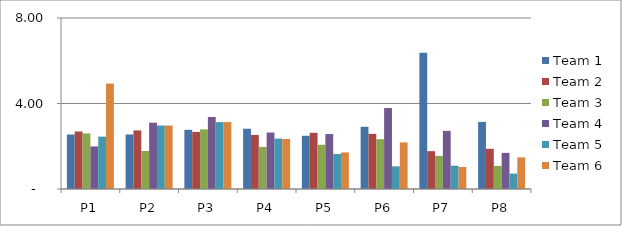
| Category | Team 1 | Team 2 | Team 3 | Team 4 | Team 5 | Team 6 |
|---|---|---|---|---|---|---|
| P1 | 2.55 | 2.69 | 2.6 | 1.99 | 2.45 | 4.93 |
| P2 | 2.55 | 2.74 | 1.78 | 3.1 | 2.97 | 2.97 |
| P3 | 2.77 | 2.67 | 2.79 | 3.37 | 3.13 | 3.13 |
| P4 | 2.82 | 2.53 | 1.97 | 2.64 | 2.36 | 2.34 |
| P5 | 2.49 | 2.63 | 2.07 | 2.57 | 1.64 | 1.71 |
| P6 | 2.91 | 2.58 | 2.33 | 3.79 | 1.06 | 2.18 |
| P7 | 6.37 | 1.77 | 1.55 | 2.72 | 1.09 | 1.03 |
| P8 | 3.14 | 1.88 | 1.08 | 1.69 | 0.72 | 1.48 |